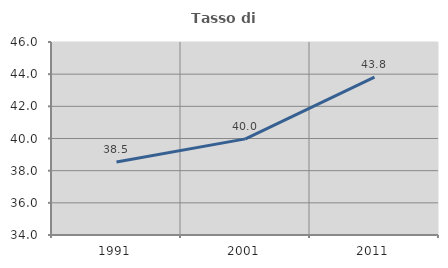
| Category | Tasso di occupazione   |
|---|---|
| 1991.0 | 38.545 |
| 2001.0 | 39.976 |
| 2011.0 | 43.818 |